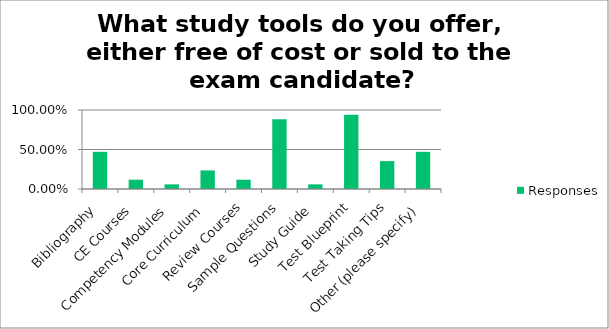
| Category | Responses |
|---|---|
| Bibliography | 0.471 |
| CE Courses | 0.118 |
| Competency Modules | 0.059 |
| Core Curriculum | 0.235 |
| Review Courses | 0.118 |
| Sample Questions | 0.882 |
| Study Guide | 0.059 |
| Test Blueprint | 0.941 |
| Test Taking Tips | 0.353 |
| Other (please specify) | 0.471 |